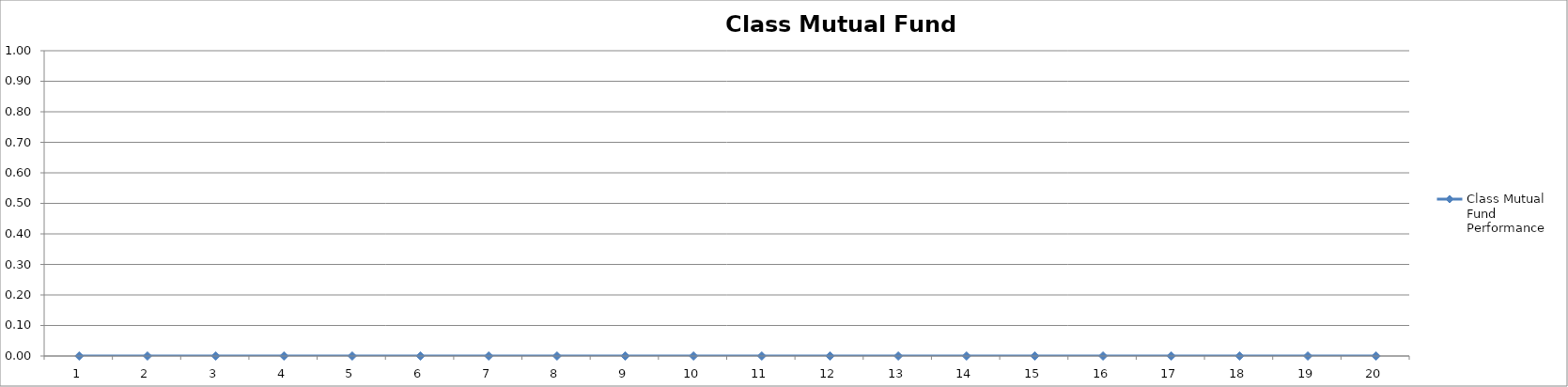
| Category | Class Mutual Fund Performance |
|---|---|
| 0 | 0 |
| 1 | 0 |
| 2 | 0 |
| 3 | 0 |
| 4 | 0 |
| 5 | 0 |
| 6 | 0 |
| 7 | 0 |
| 8 | 0 |
| 9 | 0 |
| 10 | 0 |
| 11 | 0 |
| 12 | 0 |
| 13 | 0 |
| 14 | 0 |
| 15 | 0 |
| 16 | 0 |
| 17 | 0 |
| 18 | 0 |
| 19 | 0 |